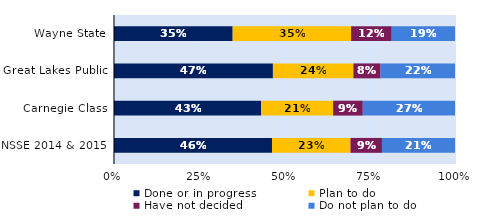
| Category | Done or in progress | Plan to do | Have not decided | Do not plan to do |
|---|---|---|---|---|
| Wayne State | 0.348 | 0.347 | 0.119 | 0.185 |
| Great Lakes Public | 0.466 | 0.236 | 0.08 | 0.218 |
| Carnegie Class | 0.431 | 0.211 | 0.087 | 0.27 |
| NSSE 2014 & 2015 | 0.463 | 0.23 | 0.092 | 0.214 |